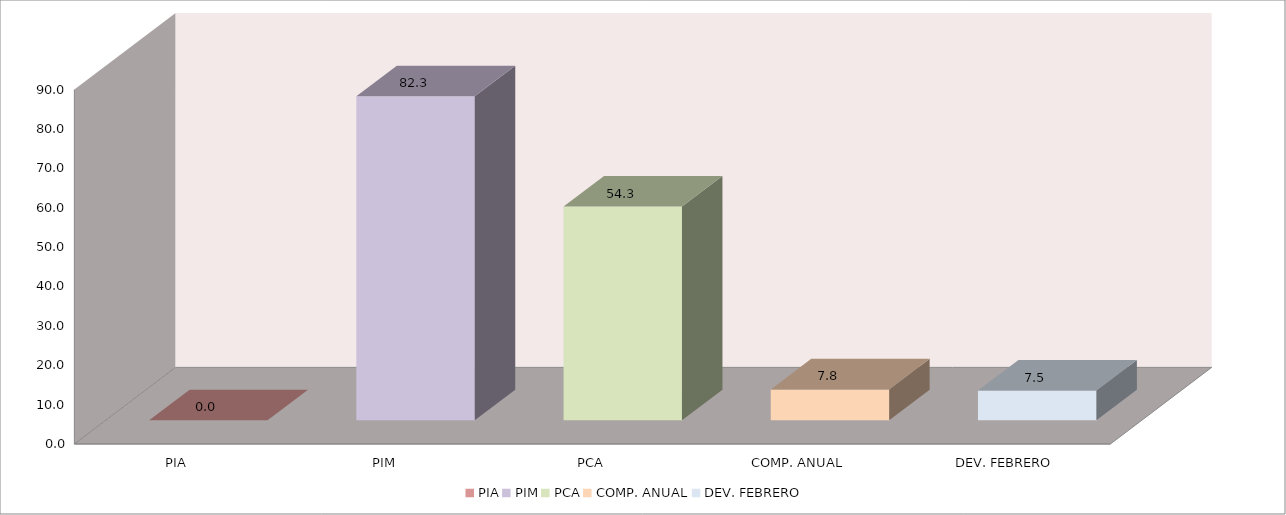
| Category | 011 MINISTERIO DE SALUD |
|---|---|
| PIA | 0 |
| PIM | 82.281 |
| PCA | 54.281 |
| COMP. ANUAL | 7.839 |
| DEV. FEBRERO | 7.544 |